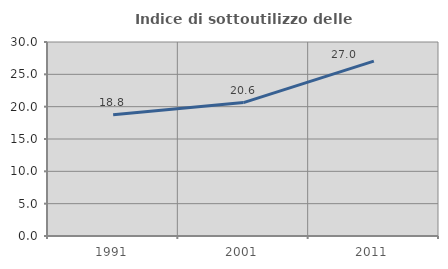
| Category | Indice di sottoutilizzo delle abitazioni  |
|---|---|
| 1991.0 | 18.768 |
| 2001.0 | 20.635 |
| 2011.0 | 27.037 |